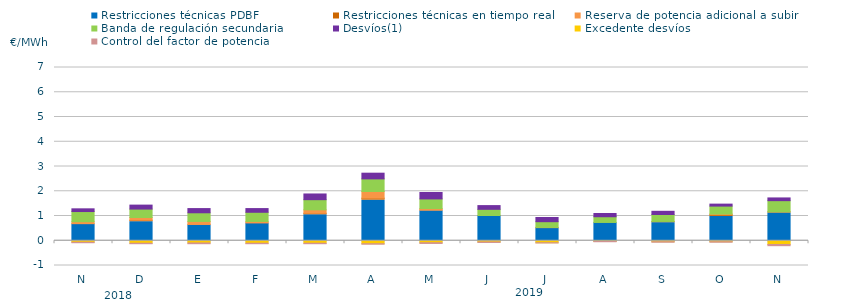
| Category | Restricciones técnicas PDBF | Restricciones técnicas en tiempo real | Reserva de potencia adicional a subir | Banda de regulación secundaria | Desvíos(1) | Excedente desvíos | Control del factor de potencia |
|---|---|---|---|---|---|---|---|
| N | 0.67 | 0.02 | 0.08 | 0.41 | 0.11 | -0.06 | -0.06 |
| D | 0.77 | 0.06 | 0.11 | 0.34 | 0.16 | -0.1 | -0.06 |
| E | 0.63 | 0.03 | 0.12 | 0.35 | 0.17 | -0.09 | -0.07 |
| F | 0.71 | 0.01 | 0.06 | 0.37 | 0.15 | -0.1 | -0.06 |
| M | 1.05 | 0.06 | 0.14 | 0.41 | 0.23 | -0.1 | -0.06 |
| A | 1.64 | 0.08 | 0.27 | 0.51 | 0.23 | -0.12 | -0.06 |
| M | 1.21 | 0.03 | 0.06 | 0.39 | 0.26 | -0.08 | -0.07 |
| J | 1.01 | 0.01 | 0 | 0.25 | 0.15 | -0.05 | -0.06 |
| J | 0.51 | 0.02 | 0.01 | 0.23 | 0.17 | -0.08 | -0.05 |
| A | 0.73 | 0.01 | 0 | 0.23 | 0.13 | -0.03 | -0.05 |
| S | 0.73 | 0.05 | 0 | 0.28 | 0.13 | -0.04 | -0.06 |
| O | 0.98 | 0.07 | 0.03 | 0.32 | 0.08 | -0.04 | -0.06 |
| N | 1.12 | 0.05 | 0 | 0.45 | 0.11 | -0.15 | -0.09 |